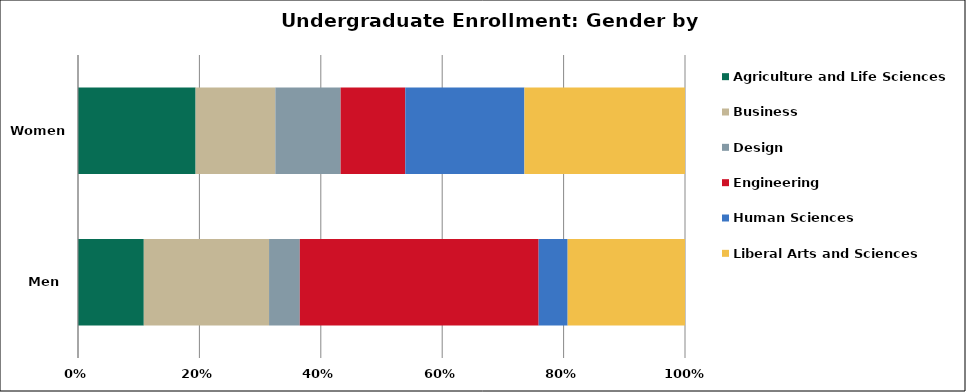
| Category | Agriculture and Life Sciences | Business | Design | Engineering | Human Sciences | Liberal Arts and Sciences |
|---|---|---|---|---|---|---|
| Men | 1521 | 2896 | 711 | 5522 | 670 | 2713 |
| Women | 2189 | 1484 | 1216 | 1203 | 2218 | 2989 |